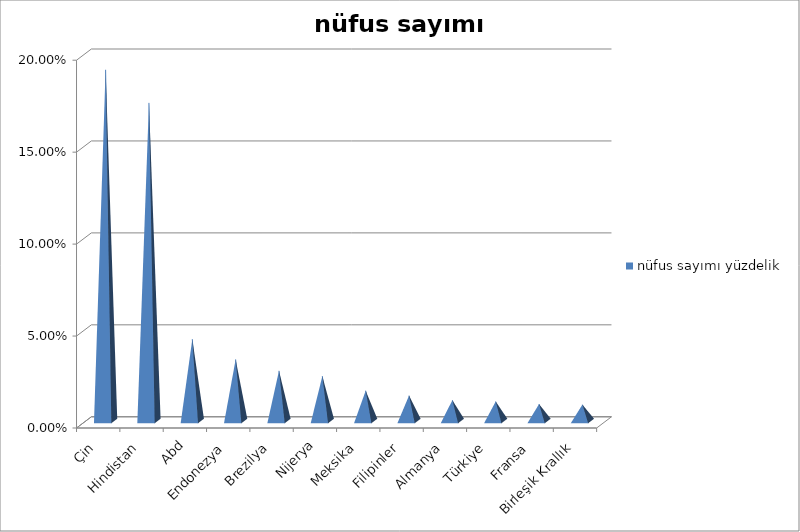
| Category | nüfus sayımı yüzdelik |
|---|---|
| Çin | 0.191 |
| Hindistan | 0.173 |
| Abd | 0.044 |
| Endonezya | 0.034 |
| Brezilya | 0.027 |
| Nijerya | 0.024 |
| Meksika | 0.016 |
| Filipinler | 0.014 |
| Almanya | 0.011 |
| Türkiye | 0.011 |
| Fransa | 0.009 |
| Birleşik Krallık | 0.009 |